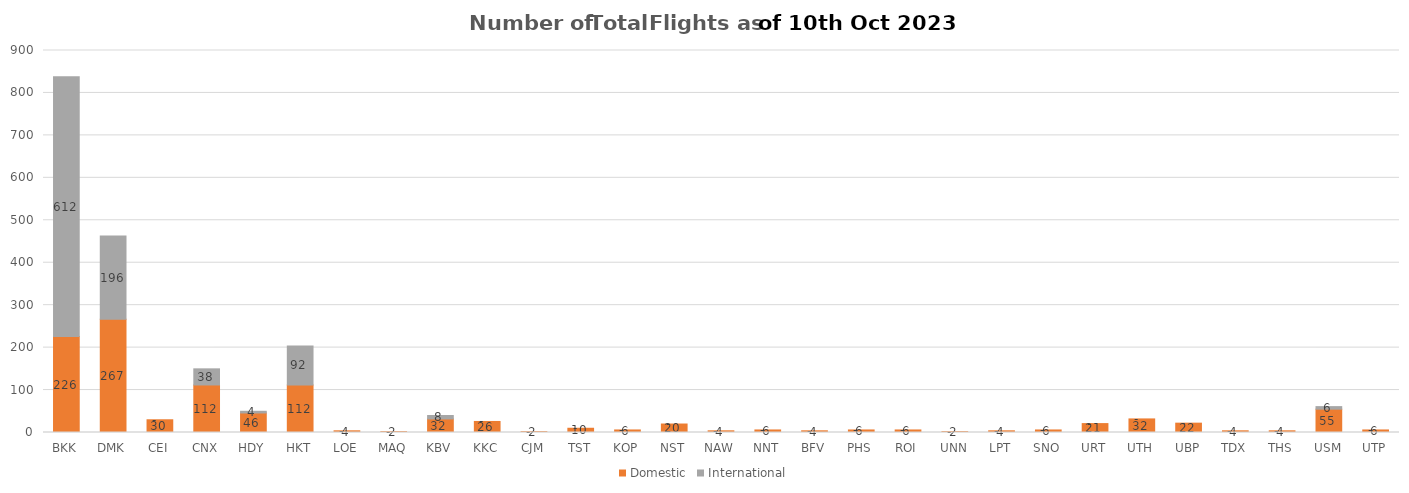
| Category | Domestic | International |
|---|---|---|
| BKK | 226 | 612 |
| DMK | 267 | 196 |
| CEI | 30 | 0 |
| CNX | 112 | 38 |
| HDY | 46 | 4 |
| HKT | 112 | 92 |
| LOE | 4 | 0 |
| MAQ | 2 | 0 |
| KBV | 32 | 8 |
| KKC | 26 | 0 |
| CJM | 2 | 0 |
| TST | 10 | 0 |
| KOP | 6 | 0 |
| NST | 20 | 0 |
| NAW | 4 | 0 |
| NNT | 6 | 0 |
| BFV | 4 | 0 |
| PHS | 6 | 0 |
| ROI | 6 | 0 |
| UNN | 2 | 0 |
| LPT | 4 | 0 |
| SNO | 6 | 0 |
| URT | 21 | 0 |
| UTH | 32 | 0 |
| UBP | 22 | 0 |
| TDX | 4 | 0 |
| THS | 4 | 0 |
| USM | 55 | 6 |
| UTP | 6 | 0 |